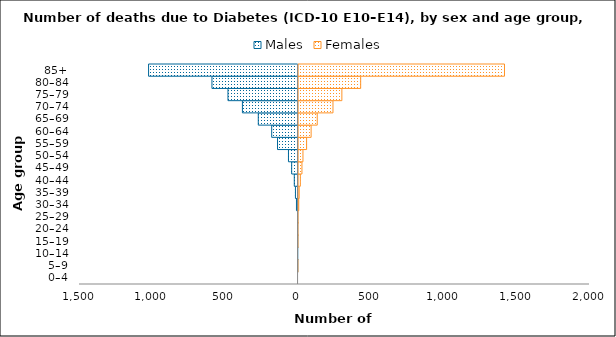
| Category | Males | Females |
|---|---|---|
| 0–4 | 0 | 0 |
| 5–9 | -1 | 1 |
| 10–14 | -1 | 0 |
| 15–19 | -1 | 2 |
| 20–24 | -2 | 2 |
| 25–29 | -2 | 3 |
| 30–34 | -11 | 8 |
| 35–39 | -18 | 11 |
| 40–44 | -26 | 19 |
| 45–49 | -44 | 30 |
| 50–54 | -66 | 37 |
| 55–59 | -141 | 62 |
| 60–64 | -181 | 93 |
| 65–69 | -273 | 135 |
| 70–74 | -382 | 243 |
| 75–79 | -481 | 304 |
| 80–84 | -591 | 433 |
| 85+ | -1026 | 1420 |